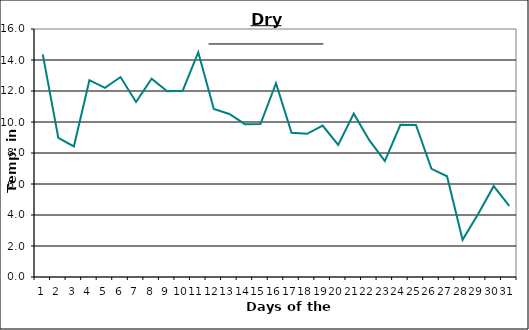
| Category | Series 0 |
|---|---|
| 0 | 14.36 |
| 1 | 8.97 |
| 2 | 8.42 |
| 3 | 12.7 |
| 4 | 12.2 |
| 5 | 12.9 |
| 6 | 11.29 |
| 7 | 12.8 |
| 8 | 11.99 |
| 9 | 12.02 |
| 10 | 14.5 |
| 11 | 10.84 |
| 12 | 10.52 |
| 13 | 9.86 |
| 14 | 9.87 |
| 15 | 12.5 |
| 16 | 9.3 |
| 17 | 9.24 |
| 18 | 9.77 |
| 19 | 8.52 |
| 20 | 10.54 |
| 21 | 8.83 |
| 22 | 7.48 |
| 23 | 9.82 |
| 24 | 9.81 |
| 25 | 6.98 |
| 26 | 6.5 |
| 27 | 2.4 |
| 28 | 4.06 |
| 29 | 5.86 |
| 30 | 4.59 |